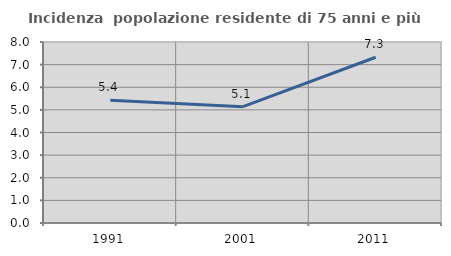
| Category | Incidenza  popolazione residente di 75 anni e più |
|---|---|
| 1991.0 | 5.427 |
| 2001.0 | 5.142 |
| 2011.0 | 7.327 |